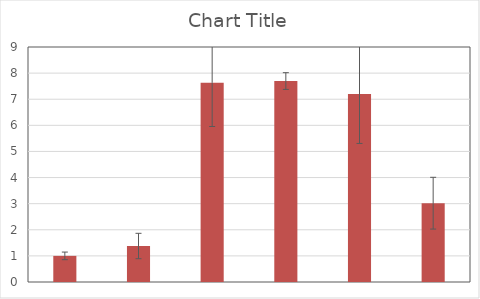
| Category | Series 1 |
|---|---|
| 0 | 1 |
| 1 | 1.378 |
| 2 | 7.634 |
| 3 | 7.696 |
| 4 | 7.195 |
| 5 | 3.018 |